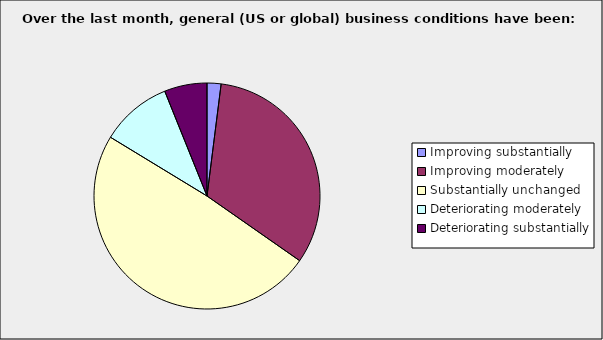
| Category | Series 0 |
|---|---|
| Improving substantially | 0.02 |
| Improving moderately | 0.327 |
| Substantially unchanged | 0.49 |
| Deteriorating moderately | 0.102 |
| Deteriorating substantially | 0.061 |